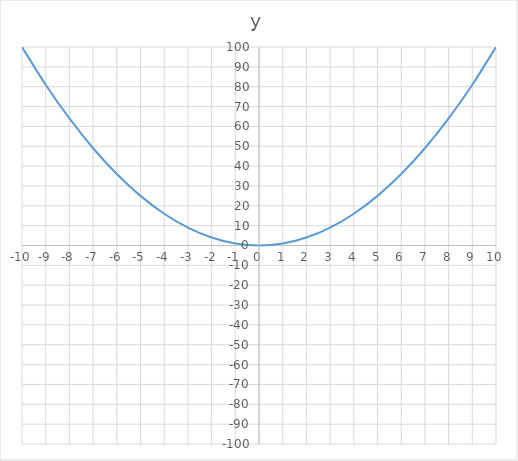
| Category | y |
|---|---|
| -10.0 | 100 |
| -9.0 | 81 |
| -8.0 | 64 |
| -7.0 | 49 |
| -6.0 | 36 |
| -5.0 | 25 |
| -4.0 | 16 |
| -3.0 | 9 |
| -2.0 | 4 |
| -1.0 | 1 |
| 0.0 | 0 |
| 1.0 | 1 |
| 2.0 | 4 |
| 3.0 | 9 |
| 4.0 | 16 |
| 5.0 | 25 |
| 6.0 | 36 |
| 7.0 | 49 |
| 8.0 | 64 |
| 9.0 | 81 |
| 10.0 | 100 |